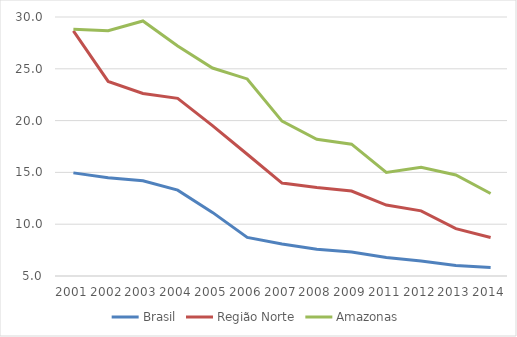
| Category | Brasil | Região Norte | Amazonas |
|---|---|---|---|
| 2001.0 | 14.955 | 28.66 | 28.826 |
| 2002.0 | 14.475 | 23.779 | 28.678 |
| 2003.0 | 14.19 | 22.619 | 29.617 |
| 2004.0 | 13.285 | 22.145 | 27.204 |
| 2005.0 | 11.14 | 19.518 | 25.075 |
| 2006.0 | 8.721 | 16.753 | 24.021 |
| 2007.0 | 8.08 | 13.97 | 19.954 |
| 2008.0 | 7.593 | 13.543 | 18.2 |
| 2009.0 | 7.309 | 13.198 | 17.721 |
| 2011.0 | 6.776 | 11.848 | 15.001 |
| 2012.0 | 6.452 | 11.29 | 15.493 |
| 2013.0 | 6.009 | 9.568 | 14.757 |
| 2014.0 | 5.816 | 8.718 | 12.961 |